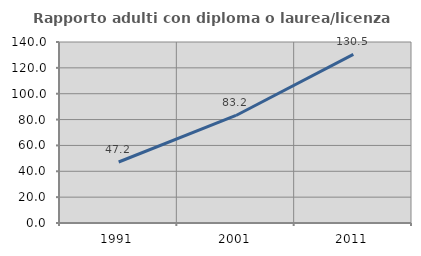
| Category | Rapporto adulti con diploma o laurea/licenza media  |
|---|---|
| 1991.0 | 47.17 |
| 2001.0 | 83.168 |
| 2011.0 | 130.476 |